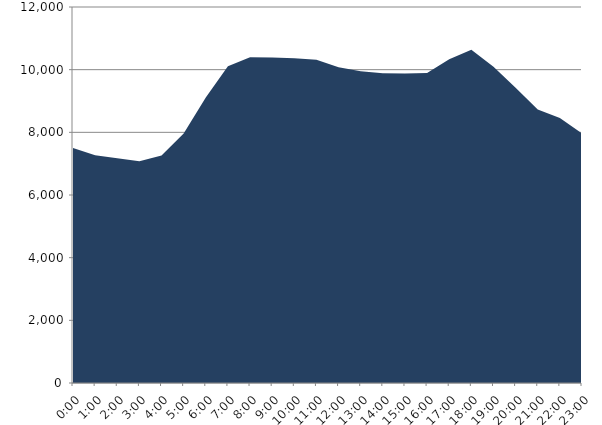
| Category | Series 0 | Series 1 |
|---|---|---|
| 2019-02-20 |  | 7502.41 |
| 2019-02-20 01:00:00 |  | 7270.61 |
| 2019-02-20 02:00:00 |  | 7176.75 |
| 2019-02-20 03:00:00 |  | 7074.26 |
| 2019-02-20 04:00:00 |  | 7259.44 |
| 2019-02-20 05:00:00 |  | 7963.89 |
| 2019-02-20 06:00:00 |  | 9110.54 |
| 2019-02-20 07:00:00 |  | 10109.37 |
| 2019-02-20 08:00:00 |  | 10400.22 |
| 2019-02-20 09:00:00 |  | 10390.93 |
| 2019-02-20 10:00:00 |  | 10364.93 |
| 2019-02-20 11:00:00 |  | 10314.96 |
| 2019-02-20 12:00:00 |  | 10074.79 |
| 2019-02-20 13:00:00 |  | 9949.22 |
| 2019-02-20 14:00:00 |  | 9885.18 |
| 2019-02-20 15:00:00 |  | 9875.16 |
| 2019-02-20 16:00:00 |  | 9892.3 |
| 2019-02-20 17:00:00 |  | 10329.15 |
| 2019-02-20 18:00:00 |  | 10632.53 |
| 2019-02-20 19:00:00 |  | 10095.37 |
| 2019-02-20 20:00:00 |  | 9422.3 |
| 2019-02-20 21:00:00 |  | 8731.28 |
| 2019-02-20 22:00:00 |  | 8457.23 |
| 2019-02-20 23:00:00 |  | 7962.06 |